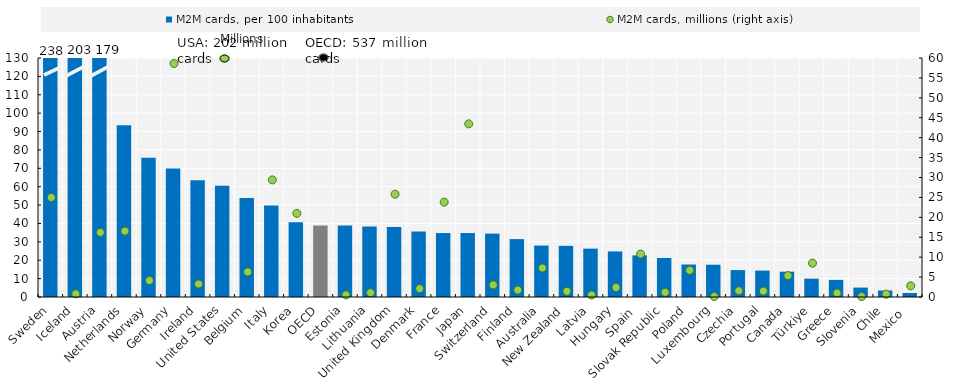
| Category | M2M cards, per 100 inhabitants  |
|---|---|
| Sweden | 238.11 |
| Iceland | 202.89 |
| Austria | 179.2 |
| Netherlands | 93.37 |
| Norway | 75.77 |
| Germany | 69.94 |
| Ireland | 63.53 |
| United States | 60.52 |
| Belgium | 53.87 |
| Italy | 49.82 |
| Korea | 40.68 |
| OECD | 38.9 |
| Estonia | 38.9 |
| Lithuania | 38.34 |
| United Kingdom | 38.07 |
| Denmark | 35.59 |
| France | 34.79 |
| Japan | 34.79 |
| Switzerland | 34.47 |
| Finland | 31.49 |
| Australia | 27.97 |
| New Zealand | 27.83 |
| Latvia | 26.3 |
| Hungary | 24.8 |
| Spain  | 22.65 |
| Slovak Republic | 21.24 |
| Poland | 17.68 |
| Luxembourg | 17.55 |
| Czechia | 14.64 |
| Portugal | 14.36 |
| Canada | 13.77 |
| Türkiye | 10 |
| Greece | 9.3 |
| Slovenia | 5.11 |
| Chile | 3.53 |
| Mexico  | 2.18 |